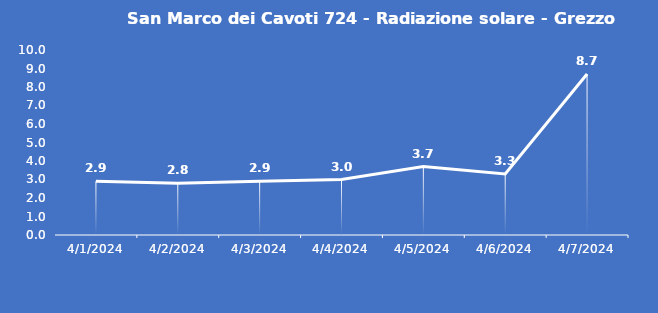
| Category | San Marco dei Cavoti 724 - Radiazione solare - Grezzo (W/m2) |
|---|---|
| 4/1/24 | 2.9 |
| 4/2/24 | 2.8 |
| 4/3/24 | 2.9 |
| 4/4/24 | 3 |
| 4/5/24 | 3.7 |
| 4/6/24 | 3.3 |
| 4/7/24 | 8.7 |